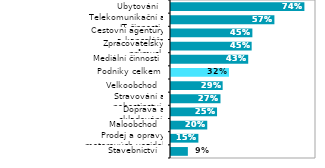
| Category | Series 0 |
|---|---|
| Stavebnictví  | 0.093 |
| Prodej a opravy motorových vozidel  | 0.151 |
| Maloobchod  | 0.2 |
| Doprava a skladování  | 0.254 |
| Stravování a pohostinství  | 0.273 |
| Velkoobchod  | 0.285 |
| Podniky celkem | 0.32 |
| Mediální činnosti | 0.426 |
| Zpracovatelský průmysl  | 0.445 |
| Cestovní agentury a kanceláře | 0.449 |
| Telekomunikační a IT činnosti  | 0.57 |
| Ubytování  | 0.736 |